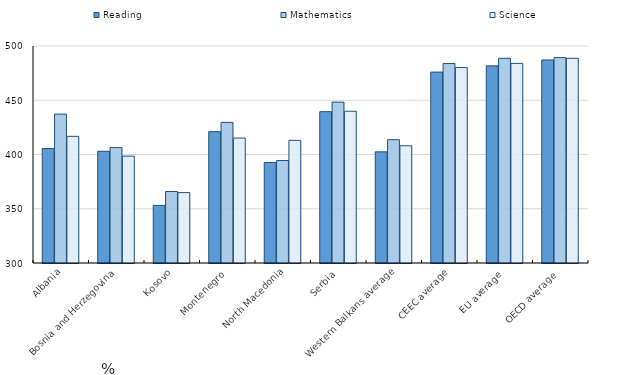
| Category | Reading | Mathematics | Science |
|---|---|---|---|
| Albania | 405.429 | 437.222 | 416.726 |
| Bosnia and Herzegovina | 402.978 | 406.384 | 398.498 |
| Kosovo | 353.065 | 365.885 | 364.882 |
| Montenegro | 421.058 | 429.612 | 415.172 |
| North Macedonia | 392.668 | 394.447 | 413.045 |
| Serbia | 439.466 | 448.283 | 439.874 |
| Western Balkans average | 402.444 | 413.639 | 408.033 |
| CEEC average | 475.956 | 483.832 | 480.129 |
| EU average | 481.686 | 488.643 | 483.965 |
| OECD average | 487.126 | 489.287 | 488.662 |